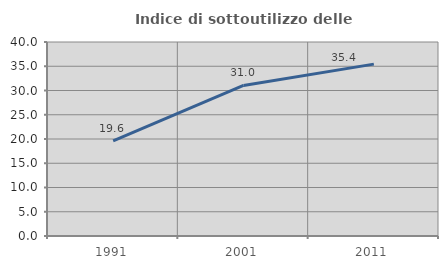
| Category | Indice di sottoutilizzo delle abitazioni  |
|---|---|
| 1991.0 | 19.637 |
| 2001.0 | 31.045 |
| 2011.0 | 35.435 |